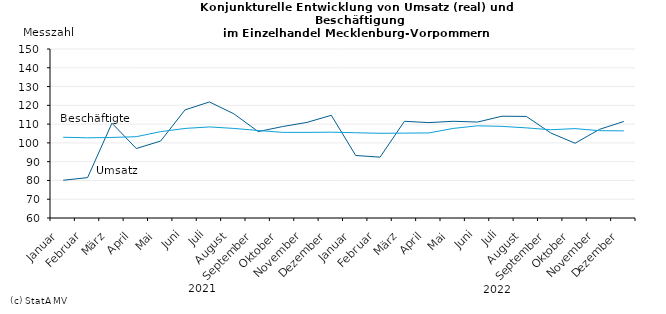
| Category | Umsatz | Beschäftigte |
|---|---|---|
|   Januar  | 80.1 | 103 |
|   Februar  | 81.5 | 102.7 |
|   März  | 110.5 | 102.9 |
|   April  | 97 | 103.3 |
|   Mai  | 101 | 106 |
|   Juni  | 117.6 | 107.7 |
|   Juli  | 121.8 | 108.5 |
|   August  | 115.5 | 107.7 |
|   September  | 106 | 106.6 |
|   Oktober  | 108.7 | 105.6 |
|   November  | 110.9 | 105.6 |
|   Dezember  | 114.7 | 105.7 |
|   Januar  | 93.3 | 105.4 |
|   Februar  | 92.4 | 105.1 |
|   März  | 111.5 | 105.2 |
|   April  | 110.8 | 105.3 |
|   Mai  | 111.5 | 107.7 |
|   Juni  | 111.1 | 109.1 |
|   Juli  | 114.2 | 108.8 |
|   August  | 114.1 | 108 |
|   September  | 105.3 | 107 |
|   Oktober  | 99.8 | 107.6 |
|   November  | 107.2 | 106.5 |
|   Dezember  | 111.4 | 106.4 |